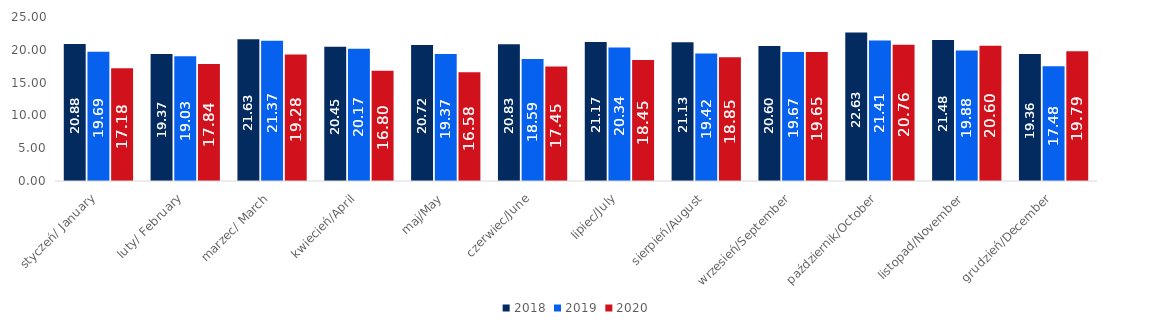
| Category | 2018 | 2019 | 2020 |
|---|---|---|---|
| styczeń/ January | 20.878 | 19.686 | 17.178 |
| luty/ February | 19.374 | 19.027 | 17.843 |
| marzec/ March | 21.626 | 21.37 | 19.277 |
| kwiecień/April | 20.452 | 20.171 | 16.805 |
| maj/May | 20.718 | 19.366 | 16.58 |
| czerwiec/June | 20.831 | 18.587 | 17.447 |
| lipiec/July | 21.17 | 20.339 | 18.445 |
| sierpień/August | 21.133 | 19.421 | 18.851 |
| wrzesień/September | 20.597 | 19.667 | 19.651 |
| październik/October | 22.632 | 21.407 | 20.763 |
| listopad/November | 21.483 | 19.879 | 20.6 |
| grudzień/December | 19.358 | 17.476 | 19.785 |